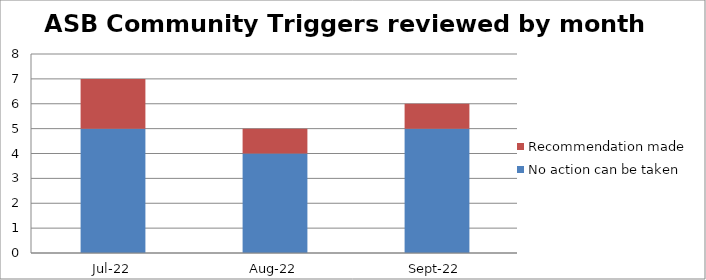
| Category | No action can be taken | Recommendation made |
|---|---|---|
| 2022-07-01 | 5 | 2 |
| 2022-08-01 | 4 | 1 |
| 2022-09-01 | 5 | 1 |